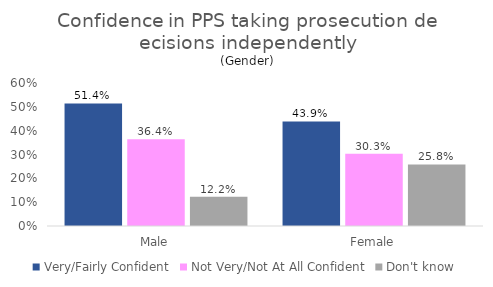
| Category | Very/Fairly Confident | Not Very/Not At All Confident | Don't know |
|---|---|---|---|
| Male | 0.514 | 0.364 | 0.122 |
| Female | 0.439 | 0.303 | 0.258 |